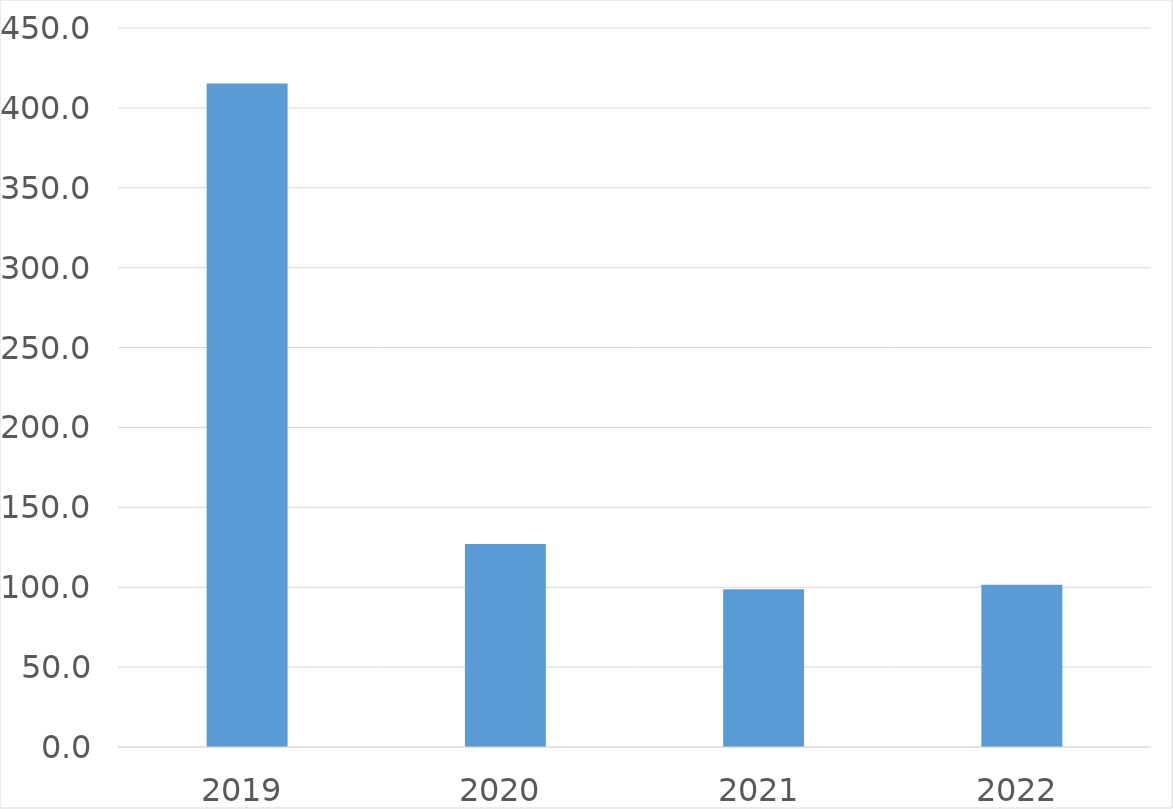
| Category | Series 0 |
|---|---|
| 2019 | 415.2 |
| 2020 | 127.1 |
| 2021 | 98.8 |
| 2022 | 101.5 |